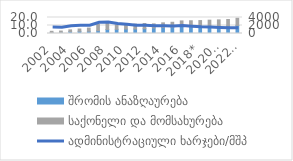
| Category | შრომის ანაზღაურება | საქონელი და მომსახურება |
|---|---|---|
| 2002 | 222.2 | 325.8 |
| 2003 | 288.6 | 320.3 |
| 2004 | 472.9 | 428.7 |
| 2005 | 549.6 | 572 |
| 2006 | 563.3 | 786.6 |
| 2007 | 696.9 | 1590.8 |
| 2008 | 1008.1 | 1606.4 |
| 2009 | 1048.3 | 1105.2 |
| 2010 | 1120.2 | 1138.6 |
| 2011 | 1136.2 | 1211 |
| 2012 | 1202.6 | 1297.7 |
| 2013 | 1395.1 | 1010.9 |
| 2014 | 1521.9 | 1143.6 |
| 2015 | 1601.7 | 1203.2 |
| 2016 | 1752.9 | 1394 |
| 2017 | 1648.9 | 1535.7 |
| 2018* | 1693 | 1540 |
| 2019** | 1762 | 1572 |
| 2020** | 1810 | 1595 |
| 2021** | 1865 | 1640 |
| 2022** | 2020 | 1780 |